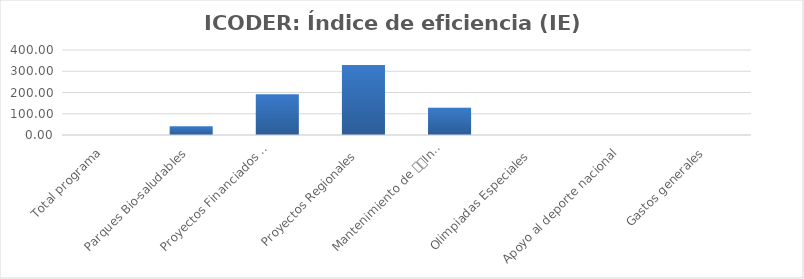
| Category | Índice de eficiencia (IE)  |
|---|---|
| Total programa | 0 |
| Parques Bio-saludables | 40.752 |
| Proyectos Financiados 
a CCDR | 191.349 |
| Proyectos Regionales  | 330 |
| Mantenimiento de 
Instalaciones Deportivas  | 127.706 |
| Olimpiadas Especiales  | 0 |
| Apoyo al deporte nacional | 0 |
| Gastos generales | 0 |